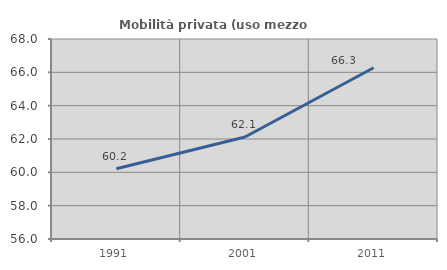
| Category | Mobilità privata (uso mezzo privato) |
|---|---|
| 1991.0 | 60.215 |
| 2001.0 | 62.118 |
| 2011.0 | 66.276 |